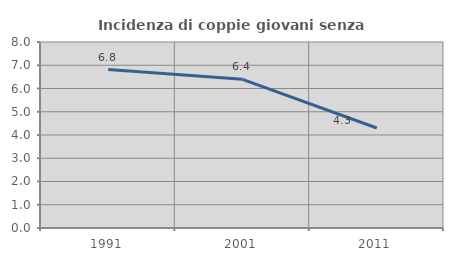
| Category | Incidenza di coppie giovani senza figli |
|---|---|
| 1991.0 | 6.814 |
| 2001.0 | 6.394 |
| 2011.0 | 4.302 |